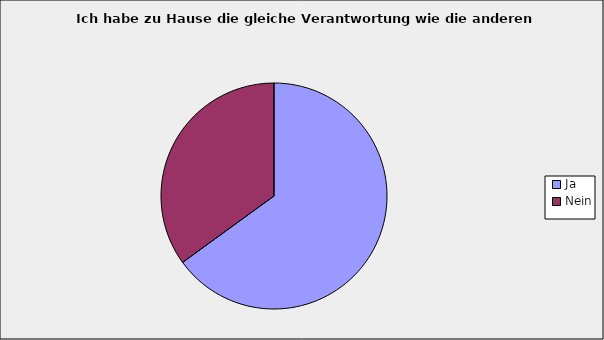
| Category | Series 0 |
|---|---|
| Ja | 0.65 |
| Nein | 0.35 |